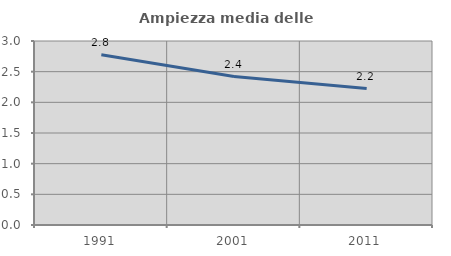
| Category | Ampiezza media delle famiglie |
|---|---|
| 1991.0 | 2.775 |
| 2001.0 | 2.42 |
| 2011.0 | 2.225 |